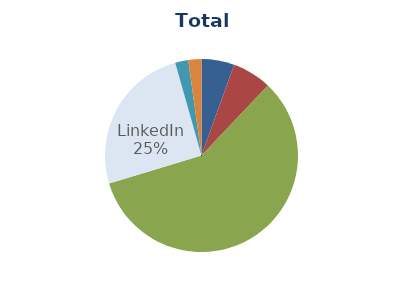
| Category | Total Inquiries |
|---|---|
| Facebook | 5 |
| Twitter | 6 |
| YouTube | 53 |
| LinkedIn | 23 |
| Google+ | 2 |
| Pinterest | 2 |
| Foursquare | 0 |